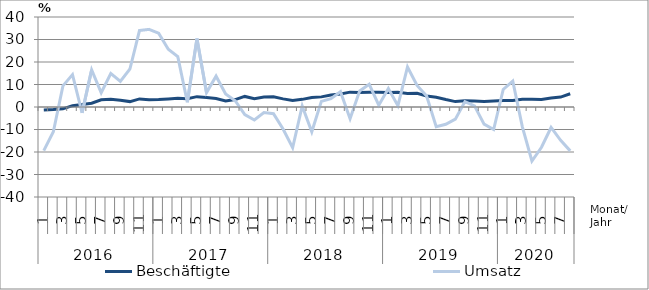
| Category | Beschäftigte | Umsatz |
|---|---|---|
| 0 | -1.3 | -19.4 |
| 1 | -1.1 | -11 |
| 2 | -0.8 | 9.4 |
| 3 | 0.6 | 14.4 |
| 4 | 1.1 | -2.6 |
| 5 | 1.7 | 16.5 |
| 6 | 3.2 | 6.3 |
| 7 | 3.4 | 14.9 |
| 8 | 3 | 11.4 |
| 9 | 2.4 | 16.9 |
| 10 | 3.6 | 34 |
| 11 | 3.2 | 34.5 |
| 12 | 3.3 | 32.8 |
| 13 | 3.6 | 25.7 |
| 14 | 3.9 | 22.4 |
| 15 | 3.7 | 2.1 |
| 16 | 4.6 | 30.4 |
| 17 | 4.2 | 6.4 |
| 18 | 3.8 | 13.7 |
| 19 | 2.7 | 5.8 |
| 20 | 3.3 | 2.8 |
| 21 | 4.7 | -3.4 |
| 22 | 3.7 | -5.8 |
| 23 | 4.4 | -2.5 |
| 24 | 4.5 | -3 |
| 25 | 3.6 | -9.8 |
| 26 | 2.9 | -18.1 |
| 27 | 3.4 | 0.5 |
| 28 | 4.2 | -11 |
| 29 | 4.5 | 2.5 |
| 30 | 5.3 | 3.7 |
| 31 | 5.8 | 6.8 |
| 32 | 6.6 | -5.2 |
| 33 | 6.5 | 7.1 |
| 34 | 6.6 | 10.1 |
| 35 | 6.6 | 0.8 |
| 36 | 6.4 | 8.2 |
| 37 | 6.5 | 0.6 |
| 38 | 6 | 17.8 |
| 39 | 6.1 | 9.6 |
| 40 | 4.9 | 4.9 |
| 41 | 4.3 | -8.8 |
| 42 | 3.3 | -7.7 |
| 43 | 2.4 | -5.4 |
| 44 | 2.8 | 2.4 |
| 45 | 2.7 | 0.5 |
| 46 | 2.5 | -7.6 |
| 47 | 2.7 | -10 |
| 48 | 2.9 | 7.8 |
| 49 | 2.9 | 11.5 |
| 50 | 3.4 | -8.8 |
| 51 | 3.4 | -24 |
| 52 | 3.3 | -17.9 |
| 53 | 4 | -9.1 |
| 54 | 4.4 | -14.8 |
| 55 | 5.9 | -19.5 |